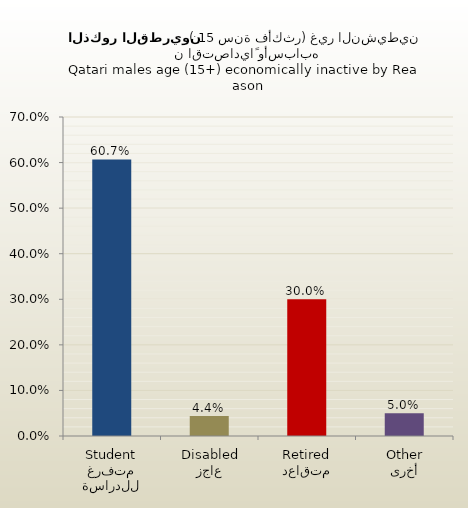
| Category | الذكور القطريين |
|---|---|
| متفرغ للدراسة
Student | 0.607 |
| عاجز
Disabled | 0.044 |
| متقاعد
Retired | 0.3 |
| أخرى
Other | 0.05 |